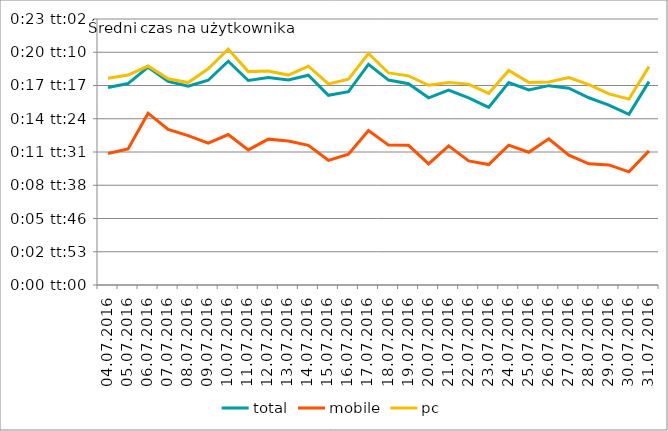
| Category | total | mobile | pc |
|---|---|---|---|
| 04.07.2016 | 0.012 | 0.008 | 0.012 |
| 05.07.2016 | 0.012 | 0.008 | 0.013 |
| 06.07.2016 | 0.013 | 0.01 | 0.013 |
| 07.07.2016 | 0.012 | 0.009 | 0.012 |
| 08.07.2016 | 0.012 | 0.009 | 0.012 |
| 09.07.2016 | 0.012 | 0.009 | 0.013 |
| 10.07.2016 | 0.013 | 0.009 | 0.014 |
| 11.07.2016 | 0.012 | 0.008 | 0.013 |
| 12.07.2016 | 0.012 | 0.009 | 0.013 |
| 13.07.2016 | 0.012 | 0.009 | 0.013 |
| 14.07.2016 | 0.013 | 0.008 | 0.013 |
| 15.07.2016 | 0.011 | 0.008 | 0.012 |
| 16.07.2016 | 0.012 | 0.008 | 0.012 |
| 17.07.2016 | 0.013 | 0.009 | 0.014 |
| 18.07.2016 | 0.012 | 0.008 | 0.013 |
| 19.07.2016 | 0.012 | 0.008 | 0.013 |
| 20.07.2016 | 0.011 | 0.007 | 0.012 |
| 21.07.2016 | 0.012 | 0.008 | 0.012 |
| 22.07.2016 | 0.011 | 0.007 | 0.012 |
| 23.07.2016 | 0.011 | 0.007 | 0.012 |
| 24.07.2016 | 0.012 | 0.008 | 0.013 |
| 25.07.2016 | 0.012 | 0.008 | 0.012 |
| 26.07.2016 | 0.012 | 0.009 | 0.012 |
| 27.07.2016 | 0.012 | 0.008 | 0.012 |
| 28.07.2016 | 0.011 | 0.007 | 0.012 |
| 29.07.2016 | 0.011 | 0.007 | 0.011 |
| 30.07.2016 | 0.01 | 0.007 | 0.011 |
| 31.07.2016 | 0.012 | 0.008 | 0.013 |